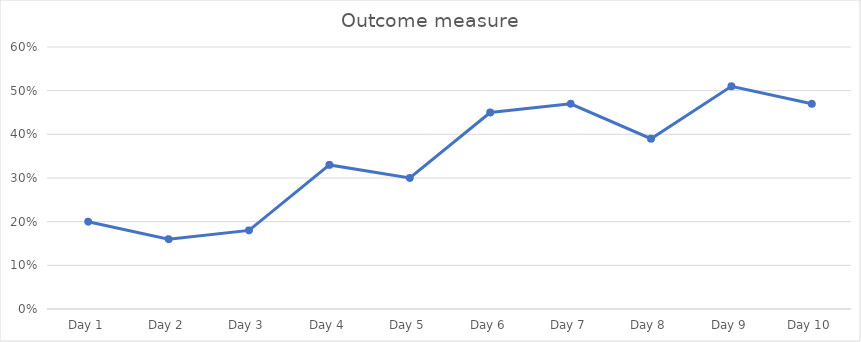
| Category | Outcome measure |
|---|---|
| Day 1 | 0.2 |
| Day 2 | 0.16 |
| Day 3 | 0.18 |
| Day 4 | 0.33 |
| Day 5 | 0.3 |
| Day 6 | 0.45 |
| Day 7 | 0.47 |
| Day 8 | 0.39 |
| Day 9 | 0.51 |
| Day 10 | 0.47 |